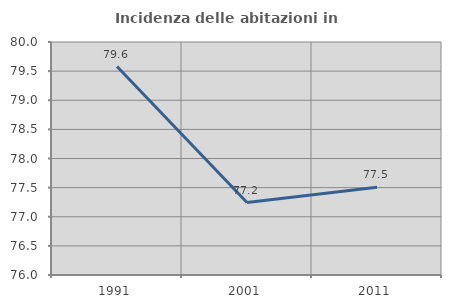
| Category | Incidenza delle abitazioni in proprietà  |
|---|---|
| 1991.0 | 79.578 |
| 2001.0 | 77.244 |
| 2011.0 | 77.505 |